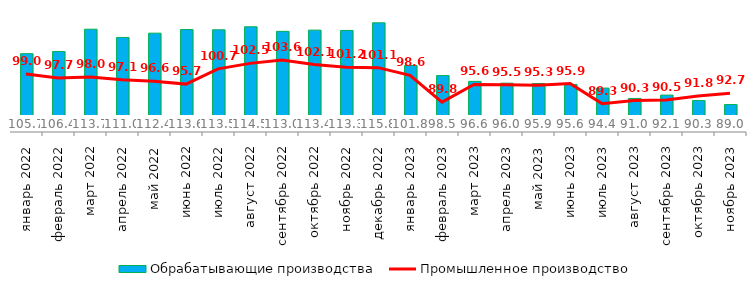
| Category | Обрабатывающие производства |
|---|---|
| 2022-01-01 | 105.687 |
| 2022-02-01 | 106.4 |
| 2022-03-01 | 113.7 |
| 2022-04-01 | 111 |
| 2022-05-01 | 112.4 |
| 2022-06-01 | 113.6 |
| 2022-07-01 | 113.5 |
| 2022-08-01 | 114.5 |
| 2022-09-01 | 113 |
| 2022-10-01 | 113.4 |
| 2022-11-01 | 113.3 |
| 2022-12-01 | 115.8 |
| 2023-01-01 | 101.8 |
| 2023-02-01 | 98.5 |
| 2023-03-01 | 96.6 |
| 2023-04-01 | 96 |
| 2023-05-01 | 95.9 |
| 2023-06-01 | 95.6 |
| 2023-07-01 | 94.4 |
| 2023-08-01 | 91 |
| 2023-09-01 | 92.1 |
| 2023-10-01 | 90.3 |
| 2023-11-01 | 89 |